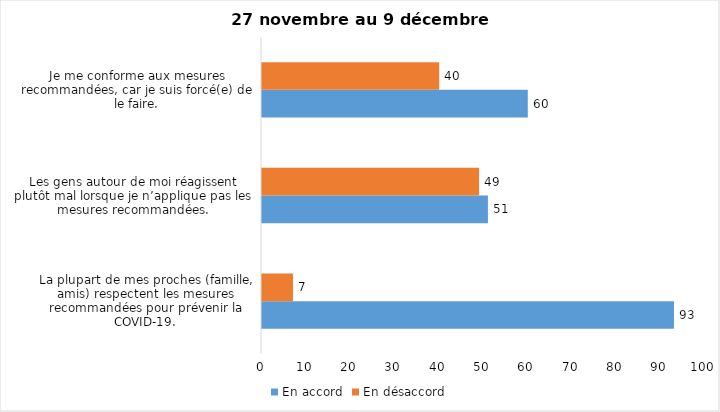
| Category | En accord | En désaccord |
|---|---|---|
| La plupart de mes proches (famille, amis) respectent les mesures recommandées pour prévenir la COVID-19. | 93 | 7 |
| Les gens autour de moi réagissent plutôt mal lorsque je n’applique pas les mesures recommandées. | 51 | 49 |
| Je me conforme aux mesures recommandées, car je suis forcé(e) de le faire. | 60 | 40 |